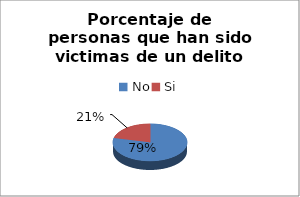
| Category | Series 0 |
|---|---|
| No | 0.788 |
| Si | 0.212 |